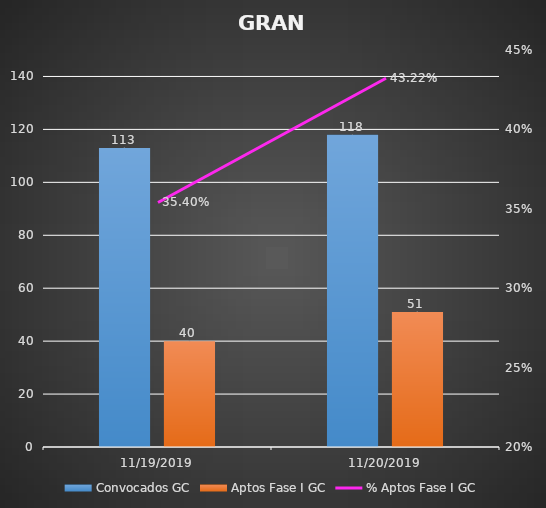
| Category | Convocados GC | Aptos Fase I GC |
|---|---|---|
| 11/19/19 | 113 | 40 |
| 11/20/19 | 118 | 51 |